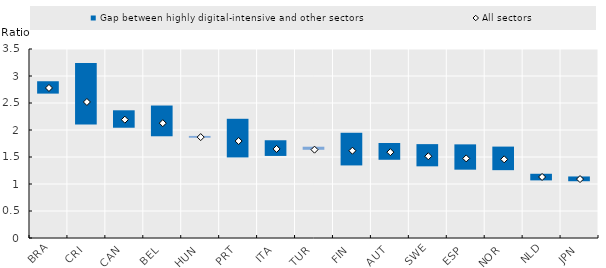
| Category | Series 2 | Gap between highly digital-intensive and other sectors |
|---|---|---|
| BRA | 2.692 | 0.21 |
| CRI | 2.122 | 1.12 |
| CAN | 2.061 | 0.304 |
| BEL | 1.902 | 0.551 |
| HUN | 1.875 | 0.016 |
| PRT | 1.511 | 0.697 |
| ITA | 1.538 | 0.272 |
| TUR | 1.652 | 0.038 |
| FIN | 1.362 | 0.586 |
| AUT | 1.467 | 0.292 |
| SWE | 1.346 | 0.393 |
| ESP | 1.284 | 0.45 |
| NOR | 1.275 | 0.418 |
| NLD | 1.085 | 0.104 |
| JPN | 1.07 | 0.07 |